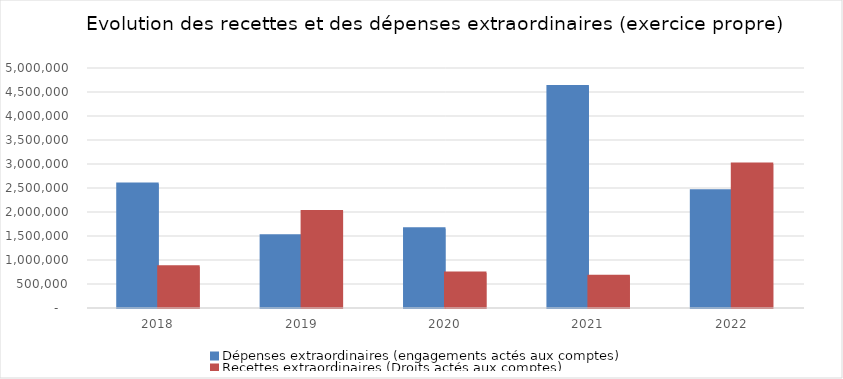
| Category | Dépenses extraordinaires (engagements actés aux comptes) | Recettes extraordinaires (Droits actés aux comptes) |
|---|---|---|
| 2018.0 | 2582255.47 | 857938.9 |
| 2019.0 | 1502793.1 | 2011746.6 |
| 2020.0 | 1649613.97 | 729797.59 |
| 2021.0 | 4613896.94 | 662406.62 |
| 2022.0 | 2440916.25 | 2999543.15 |